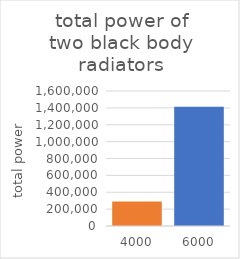
| Category | Series 0 |
|---|---|
| 4000.0 | 289557.165 |
| 6000.0 | 1414078.913 |